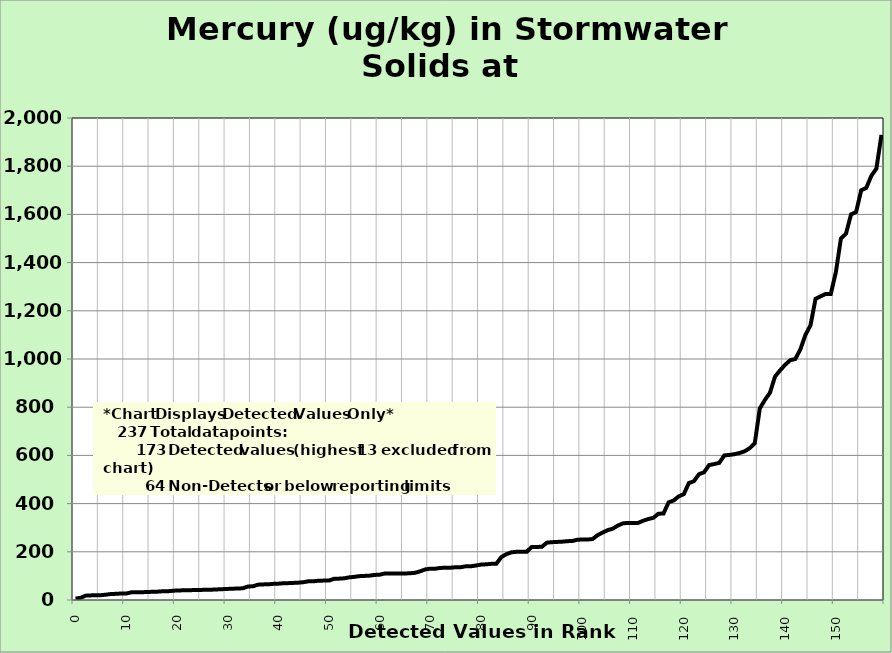
| Category | Mercury |
|---|---|
| 0.0 | 6 |
| 1.0 | 9 |
| 2.0 | 18 |
| 3.0 | 19.1 |
| 4.0 | 19.9 |
| 5.0 | 20 |
| 6.0 | 22.1 |
| 7.0 | 24.9 |
| 8.0 | 25.6 |
| 9.0 | 27 |
| 10.0 | 27 |
| 11.0 | 31.7 |
| 12.0 | 32 |
| 13.0 | 32.5 |
| 14.0 | 32.8 |
| 15.0 | 33.9 |
| 16.0 | 34.3 |
| 17.0 | 36 |
| 18.0 | 36 |
| 19.0 | 37.9 |
| 20.0 | 39.6 |
| 21.0 | 40 |
| 22.0 | 40.4 |
| 23.0 | 41 |
| 24.0 | 41.7 |
| 25.0 | 42 |
| 26.0 | 42.5 |
| 27.0 | 43 |
| 28.0 | 44 |
| 29.0 | 45 |
| 30.0 | 46 |
| 31.0 | 46.9 |
| 32.0 | 47.7 |
| 33.0 | 48.6 |
| 34.0 | 56 |
| 35.0 | 57 |
| 36.0 | 63.6 |
| 37.0 | 64.8 |
| 38.0 | 65 |
| 39.0 | 67 |
| 40.0 | 67.6 |
| 41.0 | 69.7 |
| 42.0 | 70 |
| 43.0 | 71 |
| 44.0 | 72 |
| 45.0 | 74 |
| 46.0 | 78 |
| 47.0 | 78 |
| 48.0 | 80 |
| 49.0 | 80.5 |
| 50.0 | 80.8 |
| 51.0 | 87.9 |
| 52.0 | 88.6 |
| 53.0 | 90 |
| 54.0 | 94 |
| 55.0 | 96 |
| 56.0 | 99 |
| 57.0 | 100 |
| 58.0 | 101 |
| 59.0 | 104 |
| 60.0 | 105 |
| 61.0 | 110 |
| 62.0 | 110 |
| 63.0 | 110 |
| 64.0 | 110 |
| 65.0 | 110 |
| 66.0 | 111 |
| 67.0 | 113 |
| 68.0 | 119 |
| 69.0 | 127 |
| 70.0 | 130 |
| 71.0 | 130 |
| 72.0 | 133 |
| 73.0 | 134 |
| 74.0 | 134 |
| 75.0 | 136 |
| 76.0 | 136 |
| 77.0 | 140 |
| 78.0 | 140 |
| 79.0 | 143 |
| 80.0 | 147 |
| 81.0 | 148 |
| 82.0 | 150 |
| 83.0 | 150 |
| 84.0 | 178 |
| 85.0 | 190 |
| 86.0 | 198 |
| 87.0 | 200 |
| 88.0 | 200 |
| 89.0 | 200 |
| 90.0 | 220 |
| 91.0 | 220 |
| 92.0 | 221 |
| 93.0 | 238 |
| 94.0 | 240 |
| 95.0 | 241 |
| 96.0 | 242 |
| 97.0 | 244 |
| 98.0 | 245 |
| 99.0 | 250 |
| 100.0 | 251 |
| 101.0 | 251 |
| 102.0 | 253 |
| 103.0 | 269 |
| 104.0 | 280 |
| 105.0 | 290 |
| 106.0 | 296 |
| 107.0 | 309 |
| 108.0 | 318 |
| 109.0 | 320 |
| 110.0 | 320 |
| 111.0 | 320 |
| 112.0 | 329 |
| 113.0 | 336 |
| 114.0 | 341 |
| 115.0 | 358 |
| 116.0 | 359 |
| 117.0 | 405 |
| 118.0 | 413 |
| 119.0 | 430 |
| 120.0 | 439 |
| 121.0 | 485 |
| 122.0 | 493 |
| 123.0 | 522 |
| 124.0 | 530 |
| 125.0 | 560 |
| 126.0 | 564 |
| 127.0 | 569 |
| 128.0 | 600 |
| 129.0 | 602 |
| 130.0 | 605 |
| 131.0 | 610 |
| 132.0 | 617 |
| 133.0 | 630 |
| 134.0 | 650 |
| 135.0 | 795 |
| 136.0 | 830 |
| 137.0 | 860 |
| 138.0 | 927 |
| 139.0 | 953 |
| 140.0 | 976 |
| 141.0 | 995 |
| 142.0 | 1000 |
| 143.0 | 1040 |
| 144.0 | 1100 |
| 145.0 | 1140 |
| 146.0 | 1250 |
| 147.0 | 1260 |
| 148.0 | 1270 |
| 149.0 | 1270 |
| 150.0 | 1360 |
| 151.0 | 1500 |
| 152.0 | 1520 |
| 153.0 | 1600 |
| 154.0 | 1610 |
| 155.0 | 1700 |
| 156.0 | 1710 |
| 157.0 | 1760 |
| 158.0 | 1790 |
| 159.0 | 1930 |